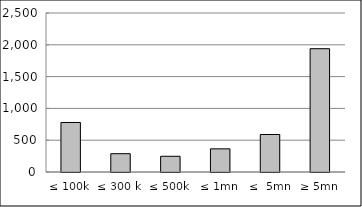
| Category | Series 0 |
|---|---|
| ≤ 100k | 778647857.603 |
| ≤ 300 k | 287757976.183 |
| ≤ 500k | 247092688.67 |
| ≤ 1mn | 364280863.7 |
| ≤  5mn | 589734848.482 |
| ≥ 5mn | 1938827548.944 |